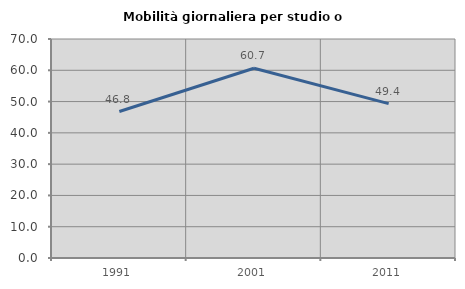
| Category | Mobilità giornaliera per studio o lavoro |
|---|---|
| 1991.0 | 46.821 |
| 2001.0 | 60.667 |
| 2011.0 | 49.359 |